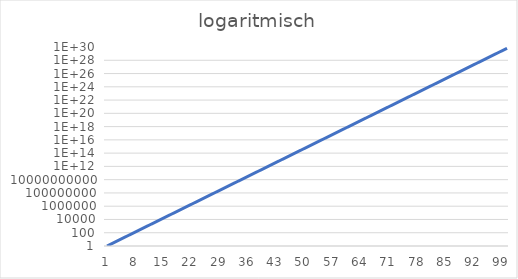
| Category | Series 0 |
|---|---|
| 0 | 1 |
| 1 | 2 |
| 2 | 4 |
| 3 | 8 |
| 4 | 16 |
| 5 | 32 |
| 6 | 64 |
| 7 | 128 |
| 8 | 256 |
| 9 | 512 |
| 10 | 1024 |
| 11 | 2048 |
| 12 | 4096 |
| 13 | 8192 |
| 14 | 16384 |
| 15 | 32768 |
| 16 | 65536 |
| 17 | 131072 |
| 18 | 262144 |
| 19 | 524288 |
| 20 | 1048576 |
| 21 | 2097152 |
| 22 | 4194304 |
| 23 | 8388608 |
| 24 | 16777216 |
| 25 | 33554432 |
| 26 | 67108864 |
| 27 | 134217728 |
| 28 | 268435456 |
| 29 | 536870912 |
| 30 | 1073741824 |
| 31 | 2147483648 |
| 32 | 4294967296 |
| 33 | 8589934592 |
| 34 | 17179869184 |
| 35 | 34359738368 |
| 36 | 68719476736 |
| 37 | 137438953472 |
| 38 | 274877906944 |
| 39 | 549755813888 |
| 40 | 1099511627776 |
| 41 | 2199023255552 |
| 42 | 4398046511104 |
| 43 | 8796093022208 |
| 44 | 17592186044416 |
| 45 | 35184372088832 |
| 46 | 70368744177664 |
| 47 | 140737488355328 |
| 48 | 281474976710656 |
| 49 | 562949953421312 |
| 50 | 1125899906842624 |
| 51 | 2251799813685248 |
| 52 | 4503599627370496 |
| 53 | 9007199254740992 |
| 54 | 18014398509481984 |
| 55 | 36028797018963968 |
| 56 | 72057594037927936 |
| 57 | 144115188075855872 |
| 58 | 288230376151711744 |
| 59 | 576460752303423488 |
| 60 | 1152921504606846976 |
| 61 | 2305843009213693952 |
| 62 | 4611686018427387904 |
| 63 | 9223372036854775808 |
| 64 | 18446744073709551616 |
| 65 | 36893488147419103232 |
| 66 | 73786976294838206464 |
| 67 | 147573952589676412928 |
| 68 | 295147905179352825856 |
| 69 | 590295810358705651712 |
| 70 | 1180591620717411303424 |
| 71 | 2361183241434822606848 |
| 72 | 4722366482869645213696 |
| 73 | 9444732965739290427392 |
| 74 | 18889465931478580854784 |
| 75 | 37778931862957161709568 |
| 76 | 75557863725914323419136 |
| 77 | 151115727451828646838272 |
| 78 | 302231454903657293676544 |
| 79 | 604462909807314587353088 |
| 80 | 1208925819614629174706176 |
| 81 | 2417851639229258349412352 |
| 82 | 4835703278458516698824704 |
| 83 | 9671406556917033397649408 |
| 84 | 19342813113834066795298816 |
| 85 | 38685626227668133590597632 |
| 86 | 77371252455336267181195264 |
| 87 | 154742504910672534362390528 |
| 88 | 309485009821345068724781056 |
| 89 | 618970019642690137449562112 |
| 90 | 1237940039285380274899124224 |
| 91 | 2475880078570760549798248448 |
| 92 | 4951760157141521099596496896 |
| 93 | 9903520314283042199192993792 |
| 94 | 19807040628566084398385987584 |
| 95 | 39614081257132168796771975168 |
| 96 | 79228162514264337593543950336 |
| 97 | 158456325028528675187087900672 |
| 98 | 316912650057057350374175801344 |
| 99 | 633825300114114700748351602688 |